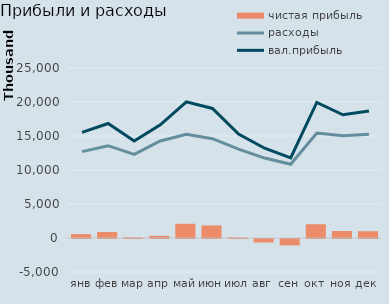
| Category | чистая прибыль |
|---|---|
| янв | 570598.4 |
| фев | 873336.926 |
| мар | 74366.68 |
| апр | 316877.639 |
| май | 2092542.272 |
| июн | 1845429.286 |
| июл | 68608.621 |
| авг | -502483.65 |
| сен | -932452.143 |
| окт | 2023133.203 |
| ноя | 1026193.246 |
| дек | 993750.034 |